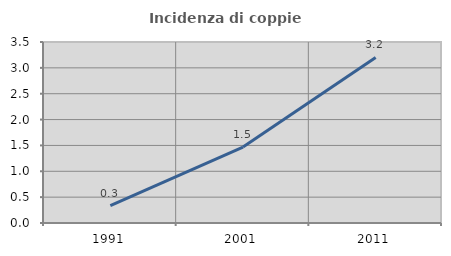
| Category | Incidenza di coppie miste |
|---|---|
| 1991.0 | 0.334 |
| 2001.0 | 1.469 |
| 2011.0 | 3.202 |